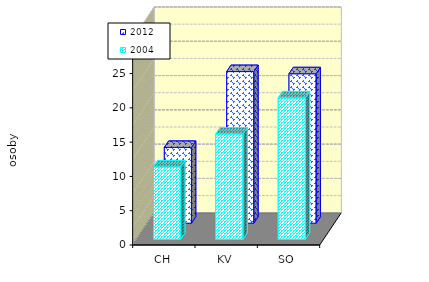
| Category | 2012 | 2004 |
|---|---|---|
| CH | 11.045 | 10.556 |
| KV | 22.105 | 15.361 |
| SO | 21.789 | 20.623 |